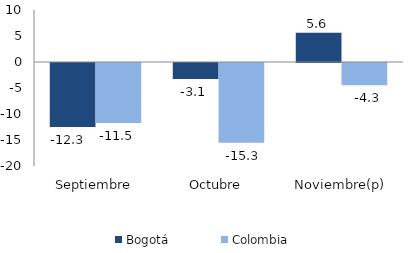
| Category | Bogotá | Colombia |
|---|---|---|
| Septiembre | -12.305 | -11.539 |
| Octubre | -3.094 | -15.316 |
| Noviembre(p) | 5.604 | -4.293 |